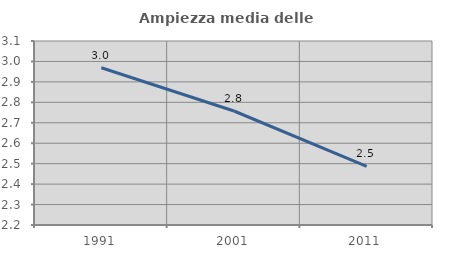
| Category | Ampiezza media delle famiglie |
|---|---|
| 1991.0 | 2.969 |
| 2001.0 | 2.758 |
| 2011.0 | 2.487 |